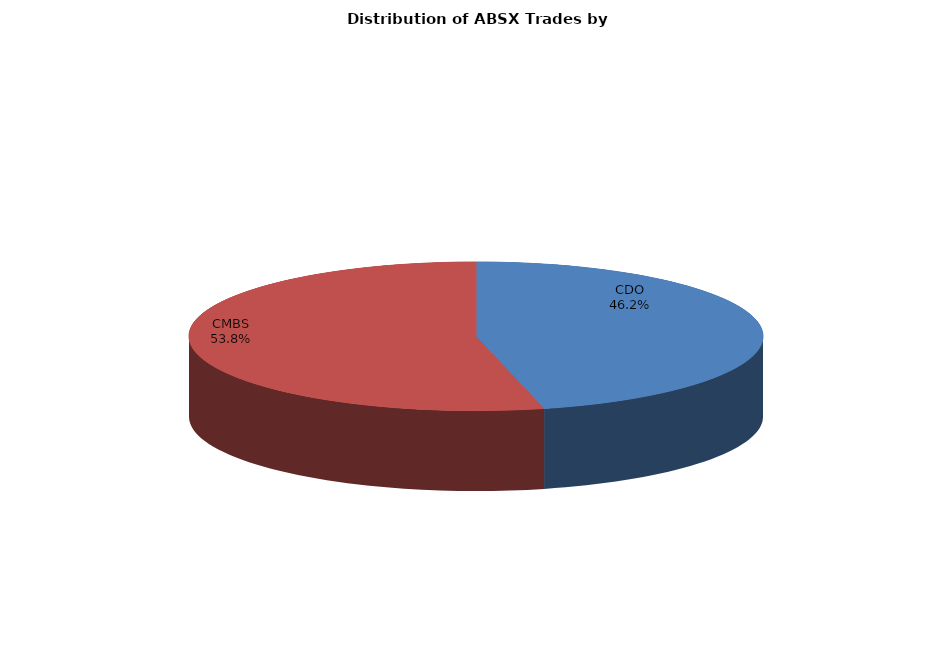
| Category | Series 0 |
|---|---|
| CDO | 206.368 |
| CMBS | 240.415 |